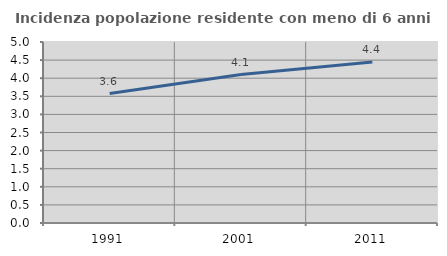
| Category | Incidenza popolazione residente con meno di 6 anni |
|---|---|
| 1991.0 | 3.576 |
| 2001.0 | 4.1 |
| 2011.0 | 4.448 |